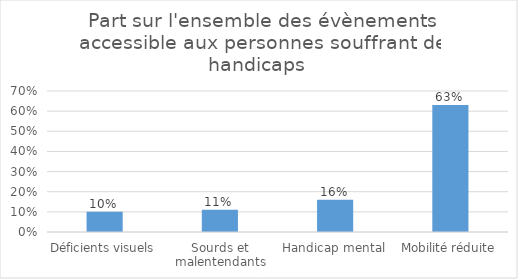
| Category | Part sur l'ensemble des évènements accessible aux personnes souffrant de handicaps  |
|---|---|
| Déficients visuels | 0.1 |
| Sourds et malentendants | 0.11 |
| Handicap mental | 0.16 |
| Mobilité réduite | 0.63 |